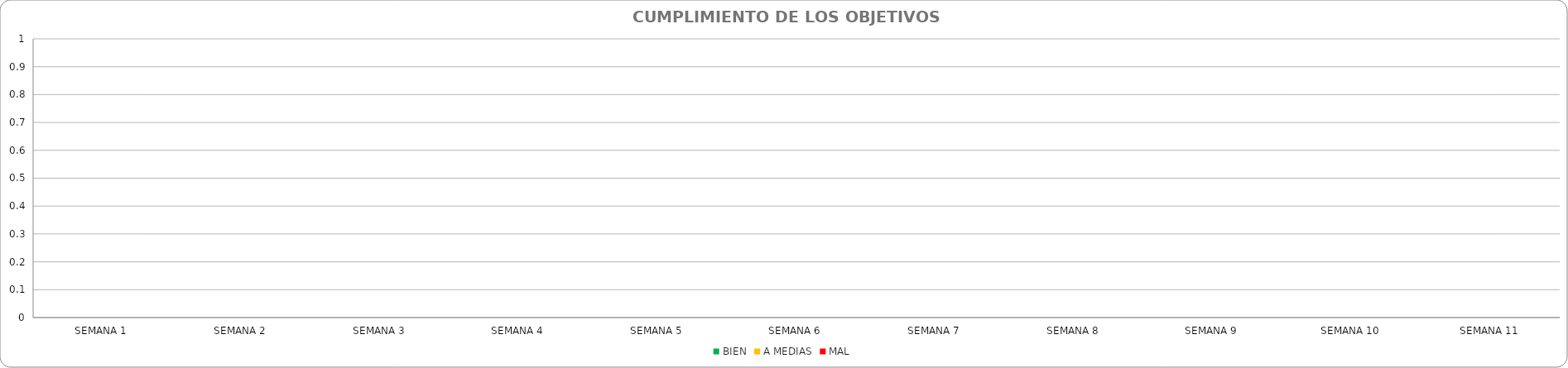
| Category | BIEN | A MEDIAS | MAL |
|---|---|---|---|
| SEMANA 1 | 0 | 0 | 0 |
| SEMANA 2 | 0 | 0 | 0 |
| SEMANA 3 | 0 | 0 | 0 |
| SEMANA 4 | 0 | 0 | 0 |
| SEMANA 5 | 0 | 0 | 0 |
| SEMANA 6 | 0 | 0 | 0 |
| SEMANA 7 | 0 | 0 | 0 |
| SEMANA 8 | 0 | 0 | 0 |
| SEMANA 9 | 0 | 0 | 0 |
| SEMANA 10 | 0 | 0 | 0 |
| SEMANA 11 | 0 | 0 | 0 |